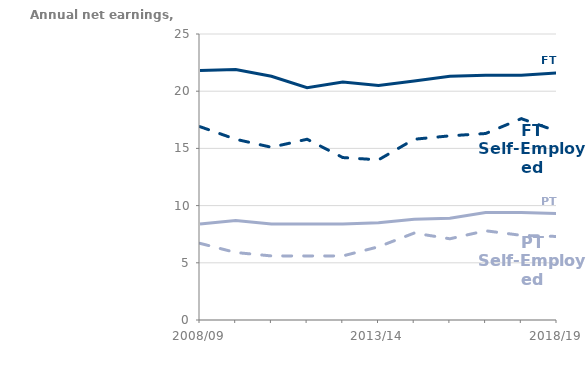
| Category | Full-Time Employees | Part-Time Self-employed | Full-Time Self-Employed | Part-Time Employees |
|---|---|---|---|---|
| 2008/09 | 21800 | 6700 | 16900 | 8400 |
| 2009/10 | 21900 | 5900 | 15800 | 8700 |
| 2010/11 | 21300 | 5600 | 15100 | 8400 |
| 2011/12 | 20300 | 5600 | 15800 | 8400 |
| 2012/13 | 20800 | 5600 | 14200 | 8400 |
| 2013/14 | 20500 | 6400 | 14000 | 8500 |
| 2014/15 | 20900 | 7600 | 15800 | 8800 |
| 2015/16 | 21300 | 7100 | 16100 | 8900 |
| 2016/17 | 21400 | 7800 | 16300 | 9400 |
| 2017/18 | 21400 | 7400 | 17600 | 9400 |
| 2018/19 | 21600 | 7300 | 16500 | 9300 |